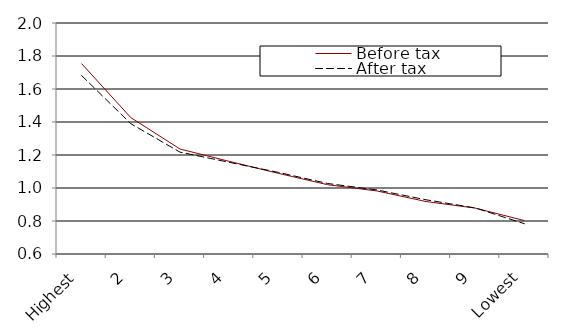
| Category | Before tax | After tax |
|---|---|---|
| Highest | 1.754 | 1.682 |
| 2 | 1.427 | 1.39 |
| 3 | 1.236 | 1.217 |
| 4 | 1.162 | 1.156 |
| 5 | 1.089 | 1.094 |
| 6 | 1.02 | 1.027 |
| 7 | 0.982 | 0.988 |
| 8 | 0.918 | 0.929 |
| 9 | 0.878 | 0.879 |
| Lowest | 0.803 | 0.784 |